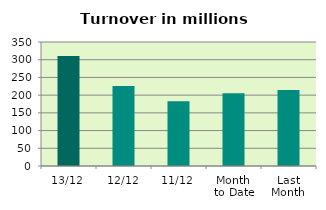
| Category | Series 0 |
|---|---|
| 13/12 | 310.44 |
| 12/12 | 225.665 |
| 11/12 | 182.614 |
| Month 
to Date | 205.216 |
| Last
Month | 214.794 |